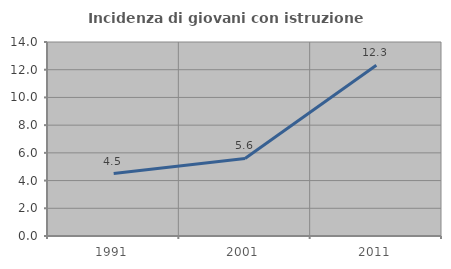
| Category | Incidenza di giovani con istruzione universitaria |
|---|---|
| 1991.0 | 4.505 |
| 2001.0 | 5.594 |
| 2011.0 | 12.315 |